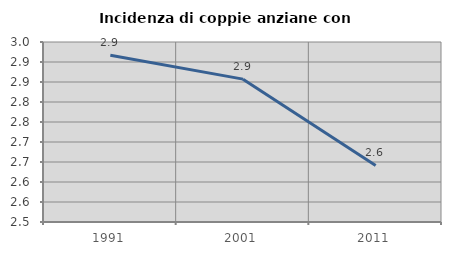
| Category | Incidenza di coppie anziane con figli |
|---|---|
| 1991.0 | 2.917 |
| 2001.0 | 2.857 |
| 2011.0 | 2.642 |